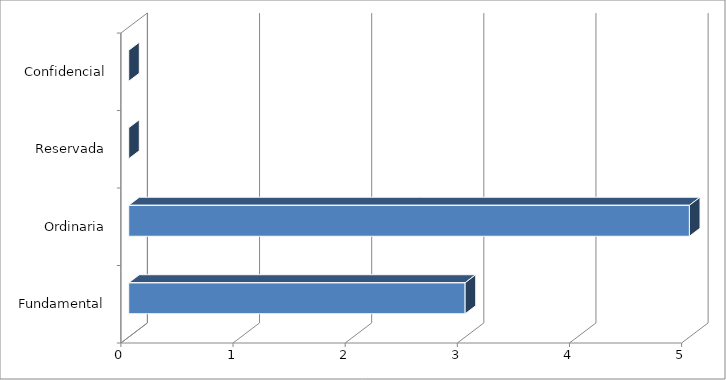
| Category | Series 0 |
|---|---|
| 0 | 3 |
| 1 | 5 |
| 2 | 0 |
| 3 | 0 |